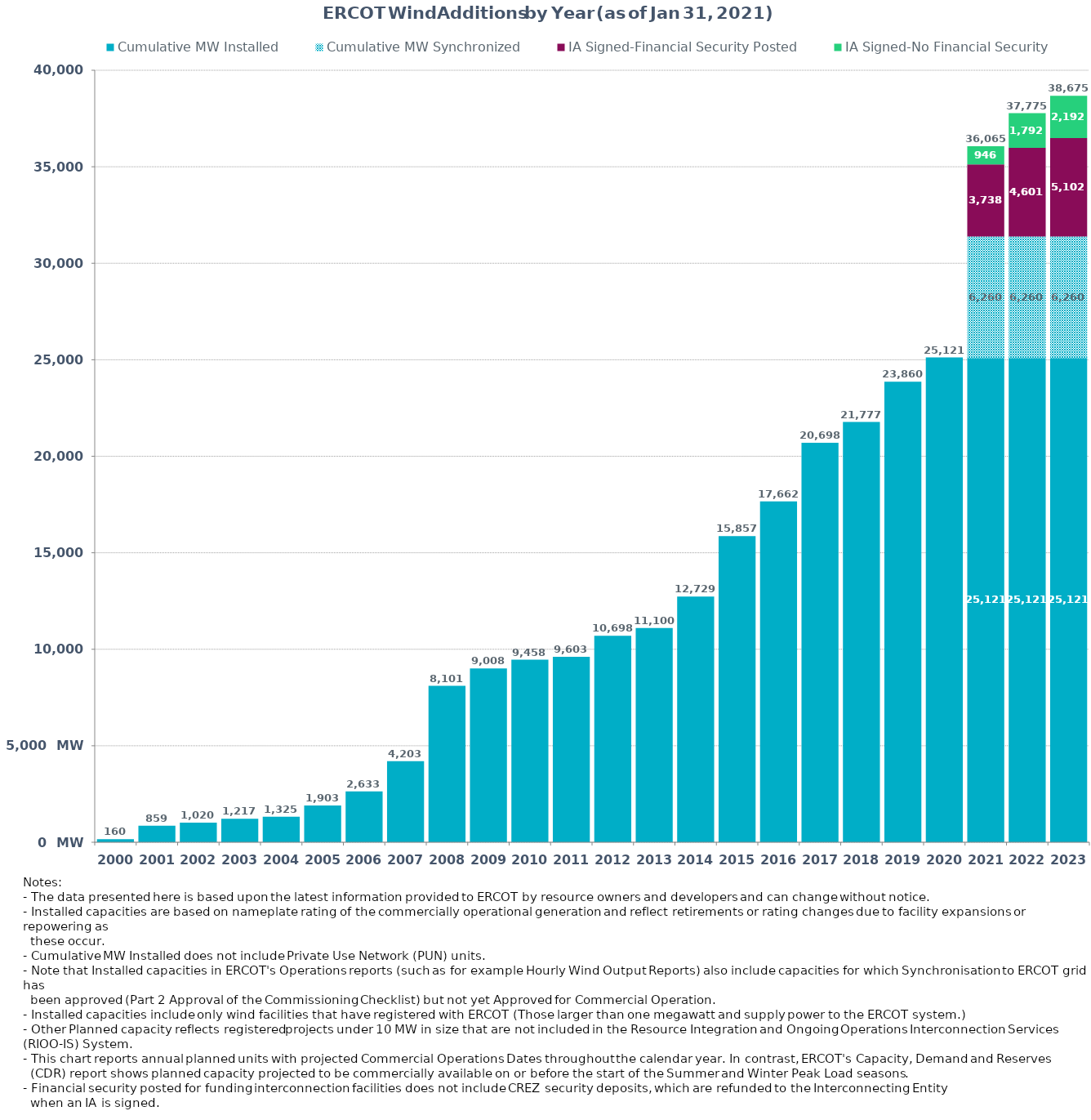
| Category | Cumulative MW Installed | Cumulative MW Synchronized | IA Signed-Financial Security Posted  | IA Signed-No Financial Security  | Other Planned | Cumulative Installed and Planned |
|---|---|---|---|---|---|---|
| 2000.0 | 160.37 | 0 | 0 | 0 | 0 | 160.37 |
| 2001.0 | 859.29 | 0 | 0 | 0 | 0 | 859.29 |
| 2002.0 | 1019.79 | 0 | 0 | 0 | 0 | 1019.79 |
| 2003.0 | 1217.29 | 0 | 0 | 0 | 0 | 1217.29 |
| 2004.0 | 1325.29 | 0 | 0 | 0 | 0 | 1325.29 |
| 2005.0 | 1902.69 | 0 | 0 | 0 | 0 | 1902.69 |
| 2006.0 | 2633.39 | 0 | 0 | 0 | 0 | 2633.39 |
| 2007.0 | 4203.41 | 0 | 0 | 0 | 0 | 4203.41 |
| 2008.0 | 8101.01 | 0 | 0 | 0 | 0 | 8101.01 |
| 2009.0 | 9007.57 | 0 | 0 | 0 | 0 | 9007.57 |
| 2010.0 | 9458.49 | 0 | 0 | 0 | 0 | 9458.49 |
| 2011.0 | 9603.49 | 0 | 0 | 0 | 0 | 9603.49 |
| 2012.0 | 10698.35 | 0 | 0 | 0 | 0 | 10698.35 |
| 2013.0 | 11100.05 | 0 | 0 | 0 | 0 | 11100.05 |
| 2014.0 | 12728.93 | 0 | 0 | 0 | 0 | 12728.93 |
| 2015.0 | 15857.48 | 0 | 0 | 0 | 0 | 15857.48 |
| 2016.0 | 17662.45 | 0 | 0 | 0 | 0 | 17662.45 |
| 2017.0 | 20697.84 | 0 | 0 | 0 | 0 | 20697.84 |
| 2018.0 | 21777 | 0 | 0 | 0 | 0 | 21777 |
| 2019.0 | 23860 | 0 | 0 | 0 | 0 | 23860 |
| 2020.0 | 25121 | 0 | 0 | 0 | 0 | 25121 |
| 2021.0 | 25120.58 | 6260.43 | 3738.04 | 946.11 | 0 | 36065.16 |
| 2022.0 | 25120.58 | 6260.43 | 4601.48 | 1792.35 | 0 | 37774.84 |
| 2023.0 | 25120.58 | 6260.43 | 5101.68 | 2192.35 | 0 | 38675.04 |